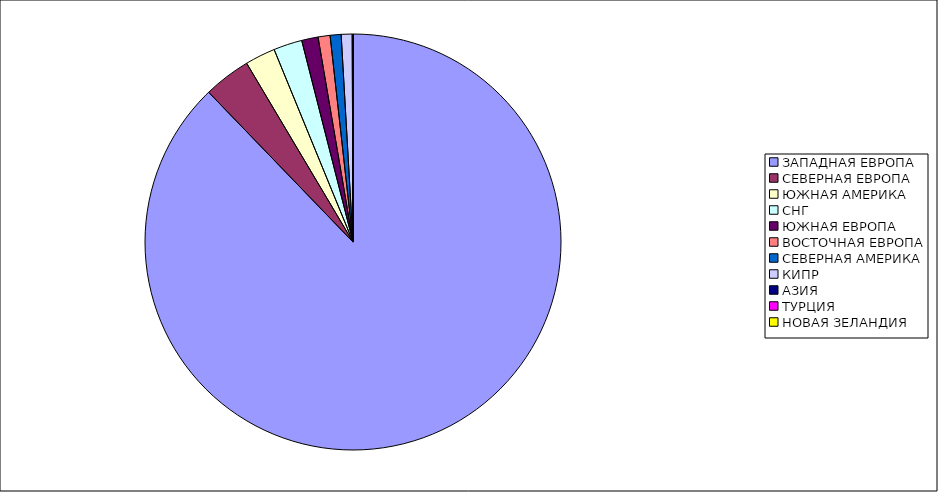
| Category | Оборот |
|---|---|
| ЗАПАДНАЯ ЕВРОПА | 0.878 |
| СЕВЕРНАЯ ЕВРОПА | 0.037 |
| ЮЖНАЯ АМЕРИКА | 0.024 |
| СНГ | 0.022 |
| ЮЖНАЯ ЕВРОПА | 0.013 |
| ВОСТОЧНАЯ ЕВРОПА | 0.009 |
| СЕВЕРНАЯ АМЕРИКА | 0.009 |
| КИПР | 0.008 |
| АЗИЯ | 0.001 |
| ТУРЦИЯ | 0 |
| НОВАЯ ЗЕЛАНДИЯ | 0 |